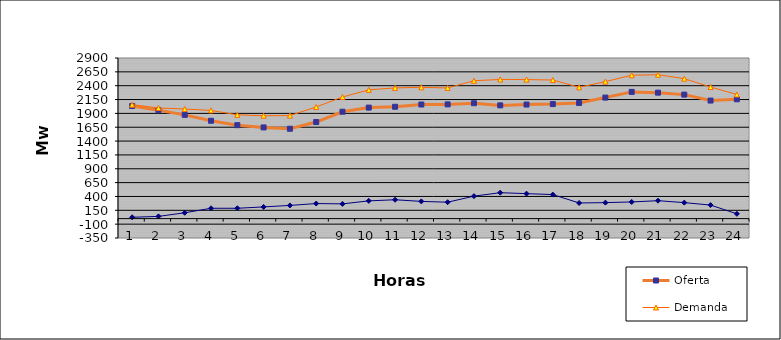
| Category | Oferta | Demanda | No Servida |
|---|---|---|---|
| 1.0 | 2032.75 | 2057.075 | 24.325 |
| 2.0 | 1957.25 | 1997.284 | 40.034 |
| 3.0 | 1873.22 | 1978.788 | 105.568 |
| 4.0 | 1766.88 | 1953.581 | 186.701 |
| 5.0 | 1687.39 | 1874.228 | 186.838 |
| 6.0 | 1646.33 | 1857.619 | 211.289 |
| 7.0 | 1622.59 | 1860.655 | 238.065 |
| 8.0 | 1743.58 | 2015.739 | 272.159 |
| 9.0 | 1929.88 | 2195.864 | 265.984 |
| 10.0 | 2004.49 | 2324.847 | 320.357 |
| 11.0 | 2019.59 | 2360.054 | 340.464 |
| 12.0 | 2060.11 | 2371.036 | 310.926 |
| 13.0 | 2062.4 | 2359.001 | 296.601 |
| 14.0 | 2083.51 | 2489.193 | 405.683 |
| 15.0 | 2044.63 | 2512.956 | 468.326 |
| 16.0 | 2059.7 | 2510.487 | 450.787 |
| 17.0 | 2068.33 | 2502.403 | 434.073 |
| 18.0 | 2088.26 | 2370.58 | 282.32 |
| 19.0 | 2185.14 | 2473.852 | 288.712 |
| 20.0 | 2287.96 | 2588.872 | 300.912 |
| 21.0 | 2274.43 | 2598.204 | 323.774 |
| 22.0 | 2238.84 | 2527.453 | 288.613 |
| 23.0 | 2131.37 | 2375.857 | 244.487 |
| 24.0 | 2154.42 | 2240.903 | 86.483 |